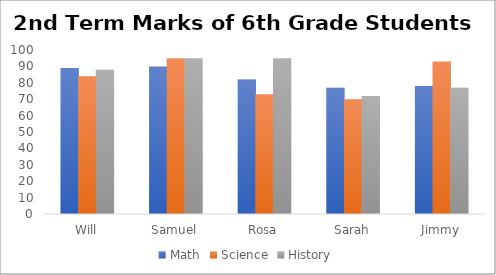
| Category | Math | Science | History |
|---|---|---|---|
| Will | 89 | 84 | 88 |
| Samuel | 90 | 95 | 95 |
| Rosa | 82 | 73 | 95 |
| Sarah | 77 | 70 | 72 |
| Jimmy | 78 | 93 | 77 |